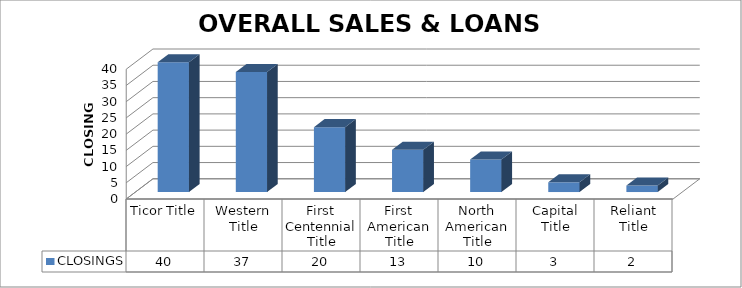
| Category | CLOSINGS |
|---|---|
| Ticor Title | 40 |
| Western Title | 37 |
| First Centennial Title | 20 |
| First American Title | 13 |
| North American Title | 10 |
| Capital Title | 3 |
| Reliant Title | 2 |